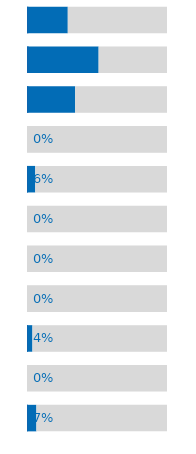
| Category | Funded% | Unmet% |
|---|---|---|
| 0 | 0.291 | 0.709 |
| 1 | 0.512 | 0.488 |
| 2 | 0.344 | 0.656 |
| 3 | 0 | 1 |
| 4 | 0.059 | 0.941 |
| 5 | 0 | 1 |
| 6 | 0 | 1 |
| 7 | 0 | 1 |
| 8 | 0.039 | 0.961 |
| 9 | 0 | 1 |
| 10 | 0.067 | 0.933 |